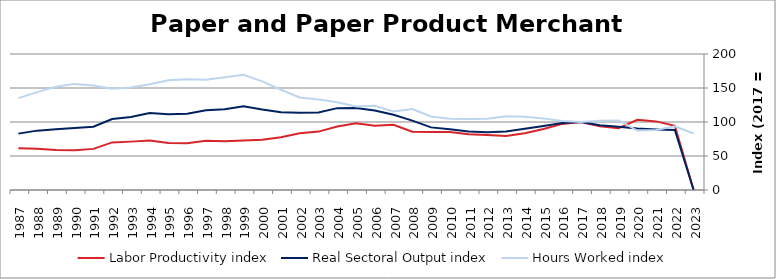
| Category | Labor Productivity index | Real Sectoral Output index | Hours Worked index |
|---|---|---|---|
| 2023.0 | 0 | 0 | 83.149 |
| 2022.0 | 94.404 | 88.398 | 93.638 |
| 2021.0 | 100.882 | 89.109 | 88.33 |
| 2020.0 | 103.255 | 90.31 | 87.463 |
| 2019.0 | 90.919 | 92.979 | 102.265 |
| 2018.0 | 93.773 | 95.377 | 101.71 |
| 2017.0 | 100 | 100 | 100 |
| 2016.0 | 97.202 | 98.572 | 101.409 |
| 2015.0 | 89.622 | 94.188 | 105.095 |
| 2014.0 | 83.527 | 90.003 | 107.753 |
| 2013.0 | 79.417 | 86.147 | 108.474 |
| 2012.0 | 80.951 | 84.952 | 104.942 |
| 2011.0 | 82.116 | 85.878 | 104.581 |
| 2010.0 | 85.376 | 89.412 | 104.727 |
| 2009.0 | 85.188 | 92.073 | 108.083 |
| 2008.0 | 85.646 | 102.035 | 119.136 |
| 2007.0 | 95.83 | 110.663 | 115.478 |
| 2006.0 | 94.549 | 116.976 | 123.72 |
| 2005.0 | 98.221 | 120.507 | 122.69 |
| 2004.0 | 93.311 | 120.376 | 129.005 |
| 2003.0 | 85.864 | 114.143 | 132.935 |
| 2002.0 | 83.49 | 113.529 | 135.979 |
| 2001.0 | 77.525 | 114.322 | 147.464 |
| 2000.0 | 74 | 118.255 | 159.804 |
| 1999.0 | 72.632 | 122.972 | 169.309 |
| 1998.0 | 71.581 | 118.659 | 165.77 |
| 1997.0 | 72.441 | 117.411 | 162.079 |
| 1996.0 | 68.873 | 112.123 | 162.796 |
| 1995.0 | 69.029 | 111.35 | 161.31 |
| 1994.0 | 72.677 | 113.072 | 155.583 |
| 1993.0 | 71.14 | 107.34 | 150.885 |
| 1992.0 | 70.018 | 104.381 | 149.078 |
| 1991.0 | 60.477 | 92.963 | 153.716 |
| 1990.0 | 58.349 | 91.056 | 156.055 |
| 1989.0 | 58.845 | 89.386 | 151.902 |
| 1988.0 | 60.647 | 87.311 | 143.965 |
| 1987.0 | 61.395 | 82.921 | 135.06 |